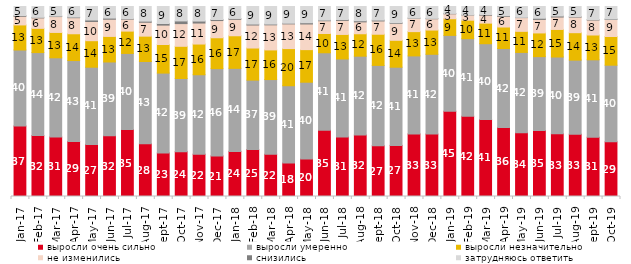
| Category | выросли очень сильно | выросли умеренно | выросли незначительно | не изменились | снизились | затрудняюсь ответить |
|---|---|---|---|---|---|---|
| 2017-01-01 | 37.15 | 39.95 | 13.2 | 4.55 | 0.4 | 4.75 |
| 2017-02-01 | 32.05 | 43.7 | 12.75 | 5.5 | 0.3 | 5.7 |
| 2017-03-01 | 31.3 | 41.7 | 13.35 | 8.35 | 0.25 | 5.05 |
| 2017-04-01 | 28.95 | 42.6 | 14.1 | 8.45 | 0.35 | 5.55 |
| 2017-05-01 | 27.4 | 40.65 | 13.95 | 10.1 | 0.8 | 7.1 |
| 2017-06-01 | 31.95 | 38.85 | 13.45 | 9.05 | 0.6 | 6.1 |
| 2017-07-01 | 35.25 | 40.05 | 11.75 | 6.25 | 0.25 | 6.45 |
| 2017-08-01 | 27.7 | 43.35 | 13.35 | 7.3 | 0.6 | 7.7 |
| 2017-09-01 | 22.95 | 42 | 15.05 | 10.2 | 0.85 | 8.95 |
| 2017-10-01 | 23.6 | 38.5 | 16.95 | 11.95 | 1.4 | 7.6 |
| 2017-11-01 | 22.25 | 41.8 | 16.15 | 11.05 | 1.05 | 7.65 |
| 2017-12-01 | 21.35 | 45.95 | 16.25 | 9.05 | 0.55 | 6.85 |
| 2018-01-01 | 23.75 | 43.7 | 17.15 | 8.65 | 0.45 | 6.3 |
| 2018-02-01 | 24.7 | 36.55 | 16.9 | 12.1 | 0.5 | 9.25 |
| 2018-03-01 | 22.25 | 39.3 | 15.6 | 13.2 | 0.4 | 9.25 |
| 2018-04-01 | 17.65 | 40.65 | 19.55 | 13 | 0.35 | 8.8 |
| 2018-05-01 | 19.75 | 40.4 | 17.15 | 13.5 | 0.65 | 8.55 |
| 2018-06-01 | 34.85 | 40.8 | 10.15 | 6.7 | 0.35 | 7.15 |
| 2018-07-01 | 31.3 | 41.05 | 12.9 | 7.4 | 0.45 | 6.85 |
| 2018-08-01 | 32.35 | 41.5 | 11.8 | 6.25 | 0.6 | 7.5 |
| 2018-09-01 | 26.7 | 42.3 | 16.4 | 7 | 0.45 | 7.15 |
| 2018-10-01 | 26.9 | 41.15 | 14.15 | 8.9 | 0.35 | 8.55 |
| 2018-11-01 | 32.934 | 41.068 | 12.774 | 7.036 | 0.1 | 6.088 |
| 2018-12-01 | 32.85 | 42 | 12.75 | 5.95 | 0.2 | 6.25 |
| 2019-01-01 | 44.85 | 39.95 | 8.75 | 2.6 | 0.2 | 3.65 |
| 2019-02-01 | 42.2 | 40.85 | 9.75 | 2.7 | 0.1 | 4.4 |
| 2019-03-01 | 40.527 | 39.881 | 10.84 | 4.177 | 0.348 | 4.227 |
| 2019-04-01 | 36.337 | 41.535 | 11.337 | 5.594 | 0.396 | 4.802 |
| 2019-05-01 | 33.531 | 42.298 | 11.095 | 7.231 | 0.149 | 5.696 |
| 2019-06-01 | 34.763 | 38.853 | 12.469 | 7.132 | 0.599 | 6.185 |
| 2019-07-01 | 32.97 | 40.446 | 14.505 | 6.535 | 0.545 | 5 |
| 2019-08-01 | 32.767 | 39.011 | 14.436 | 8.192 | 0.25 | 5.345 |
| 2019-09-01 | 31.188 | 40.743 | 13.069 | 7.871 | 0.248 | 6.881 |
| 2019-10-01 | 28.762 | 40.347 | 15.099 | 8.96 | 0.248 | 6.584 |